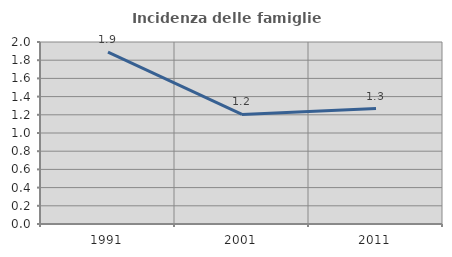
| Category | Incidenza delle famiglie numerose |
|---|---|
| 1991.0 | 1.89 |
| 2001.0 | 1.204 |
| 2011.0 | 1.269 |